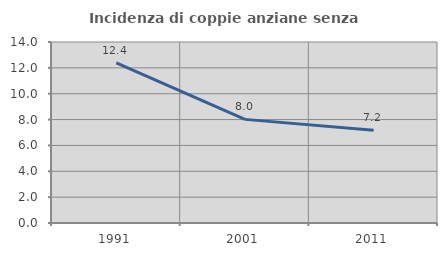
| Category | Incidenza di coppie anziane senza figli  |
|---|---|
| 1991.0 | 12.393 |
| 2001.0 | 8.015 |
| 2011.0 | 7.165 |